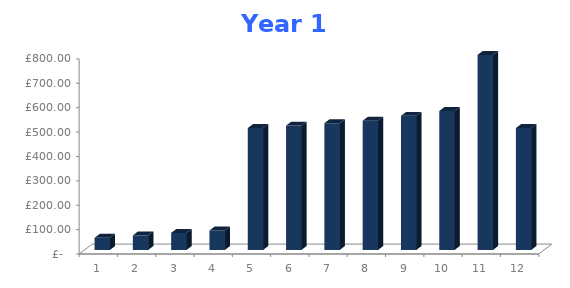
| Category | Series 1 |
|---|---|
| 0 | 50 |
| 1 | 60 |
| 2 | 70 |
| 3 | 80 |
| 4 | 500 |
| 5 | 510 |
| 6 | 520 |
| 7 | 530 |
| 8 | 550 |
| 9 | 570 |
| 10 | 800 |
| 11 | 500 |